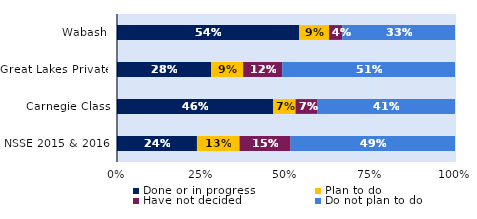
| Category | Done or in progress | Plan to do | Have not decided | Do not plan to do |
|---|---|---|---|---|
| Wabash | 0.539 | 0.088 | 0.039 | 0.333 |
| Great Lakes Private | 0.279 | 0.094 | 0.116 | 0.511 |
| Carnegie Class | 0.462 | 0.066 | 0.065 | 0.406 |
| NSSE 2015 & 2016 | 0.237 | 0.126 | 0.151 | 0.487 |